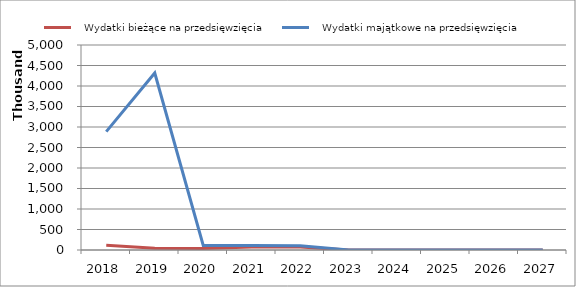
| Category |    Wydatki bieżące na przedsięwzięcia |    Wydatki majątkowe na przedsięwzięcia |
|---|---|---|
| 2018.0 | 116600 | 2886874 |
| 2019.0 | 43995 | 4316400 |
| 2020.0 | 36600 | 112400 |
| 2021.0 | 73710 | 109290 |
| 2022.0 | 73710 | 105290 |
| 2023.0 | 0 | 0 |
| 2024.0 | 0 | 0 |
| 2025.0 | 0 | 0 |
| 2026.0 | 0 | 0 |
| 2027.0 | 0 | 0 |